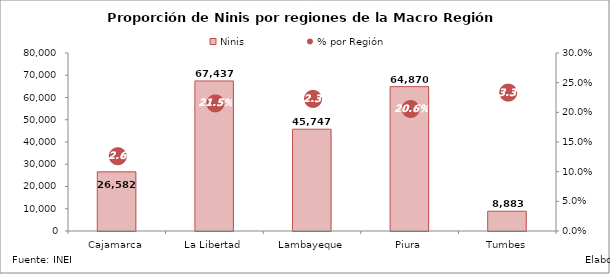
| Category | Ninis |
|---|---|
| Cajamarca | 26581.63 |
| La Libertad | 67437.21 |
| Lambayeque | 45747.04 |
| Piura | 64869.87 |
| Tumbes | 8882.95 |